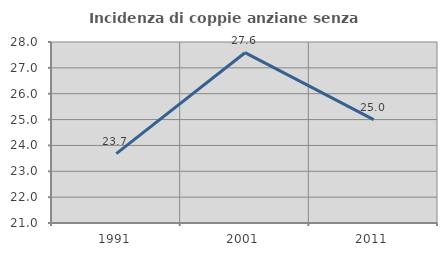
| Category | Incidenza di coppie anziane senza figli  |
|---|---|
| 1991.0 | 23.684 |
| 2001.0 | 27.586 |
| 2011.0 | 25 |